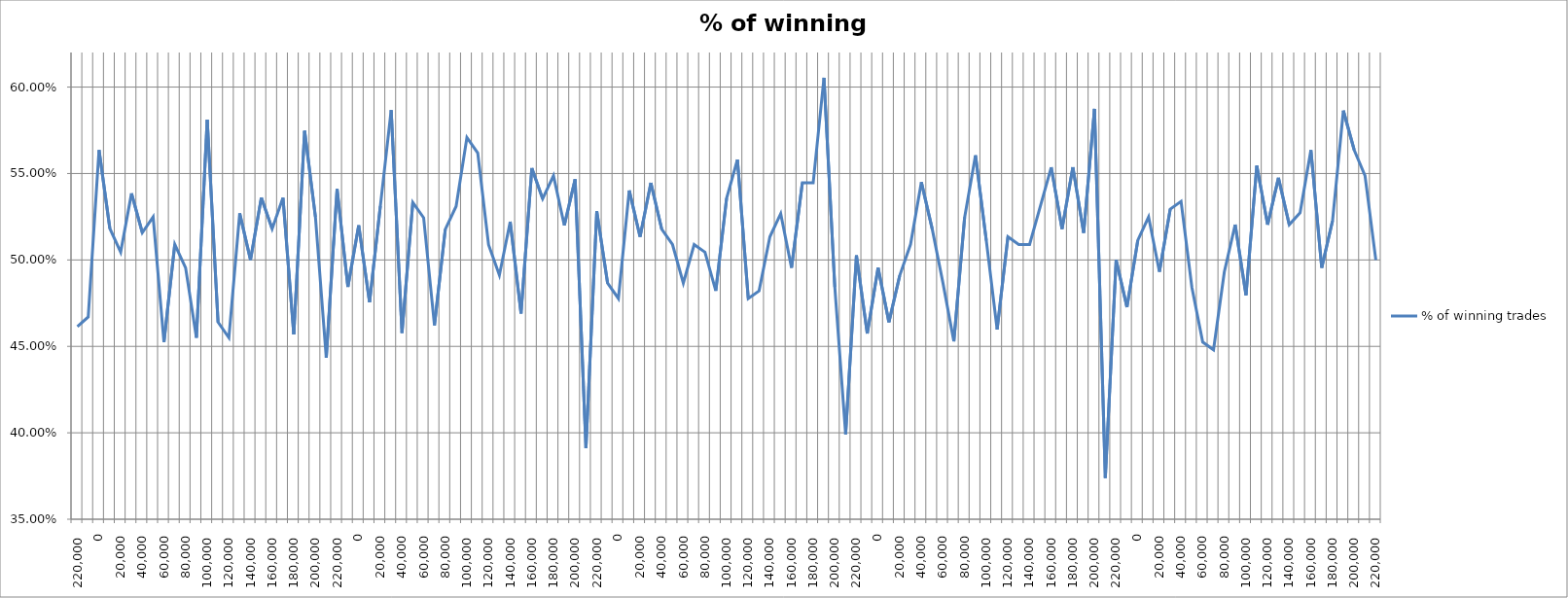
| Category | % of winning trades |
|---|---|
| 220000.0 | 0.462 |
| 230000.0 | 0.467 |
| 0.0 | 0.564 |
| 10000.0 | 0.518 |
| 20000.0 | 0.504 |
| 30000.0 | 0.538 |
| 40000.0 | 0.516 |
| 50000.0 | 0.525 |
| 60000.0 | 0.452 |
| 70000.0 | 0.509 |
| 80000.0 | 0.496 |
| 90000.0 | 0.455 |
| 100000.0 | 0.581 |
| 110000.0 | 0.464 |
| 120000.0 | 0.455 |
| 130000.0 | 0.527 |
| 140000.0 | 0.5 |
| 150000.0 | 0.536 |
| 160000.0 | 0.518 |
| 170000.0 | 0.536 |
| 180000.0 | 0.457 |
| 190000.0 | 0.575 |
| 200000.0 | 0.525 |
| 210000.0 | 0.443 |
| 220000.0 | 0.541 |
| 230000.0 | 0.484 |
| 0.0 | 0.52 |
| 10000.0 | 0.476 |
| 20000.0 | 0.531 |
| 30000.0 | 0.587 |
| 40000.0 | 0.458 |
| 50000.0 | 0.533 |
| 60000.0 | 0.524 |
| 70000.0 | 0.462 |
| 80000.0 | 0.518 |
| 90000.0 | 0.531 |
| 100000.0 | 0.571 |
| 110000.0 | 0.562 |
| 120000.0 | 0.509 |
| 130000.0 | 0.491 |
| 140000.0 | 0.522 |
| 150000.0 | 0.469 |
| 160000.0 | 0.553 |
| 170000.0 | 0.535 |
| 180000.0 | 0.549 |
| 190000.0 | 0.52 |
| 200000.0 | 0.547 |
| 210000.0 | 0.391 |
| 220000.0 | 0.528 |
| 230000.0 | 0.487 |
| 0.0 | 0.478 |
| 10000.0 | 0.54 |
| 20000.0 | 0.513 |
| 30000.0 | 0.545 |
| 40000.0 | 0.518 |
| 50000.0 | 0.509 |
| 60000.0 | 0.487 |
| 70000.0 | 0.509 |
| 80000.0 | 0.504 |
| 90000.0 | 0.482 |
| 100000.0 | 0.536 |
| 110000.0 | 0.558 |
| 120000.0 | 0.478 |
| 130000.0 | 0.482 |
| 140000.0 | 0.513 |
| 150000.0 | 0.527 |
| 160000.0 | 0.496 |
| 170000.0 | 0.545 |
| 180000.0 | 0.545 |
| 190000.0 | 0.605 |
| 200000.0 | 0.484 |
| 210000.0 | 0.399 |
| 220000.0 | 0.503 |
| 230000.0 | 0.457 |
| 0.0 | 0.496 |
| 10000.0 | 0.464 |
| 20000.0 | 0.491 |
| 30000.0 | 0.509 |
| 40000.0 | 0.545 |
| 50000.0 | 0.518 |
| 60000.0 | 0.486 |
| 70000.0 | 0.453 |
| 80000.0 | 0.525 |
| 90000.0 | 0.56 |
| 100000.0 | 0.511 |
| 110000.0 | 0.46 |
| 120000.0 | 0.513 |
| 130000.0 | 0.509 |
| 140000.0 | 0.509 |
| 150000.0 | 0.531 |
| 160000.0 | 0.554 |
| 170000.0 | 0.518 |
| 180000.0 | 0.554 |
| 190000.0 | 0.516 |
| 200000.0 | 0.587 |
| 210000.0 | 0.374 |
| 220000.0 | 0.5 |
| 230000.0 | 0.473 |
| 0.0 | 0.511 |
| 10000.0 | 0.525 |
| 20000.0 | 0.493 |
| 30000.0 | 0.529 |
| 40000.0 | 0.534 |
| 50000.0 | 0.484 |
| 60000.0 | 0.452 |
| 70000.0 | 0.448 |
| 80000.0 | 0.493 |
| 90000.0 | 0.52 |
| 100000.0 | 0.48 |
| 110000.0 | 0.554 |
| 120000.0 | 0.52 |
| 130000.0 | 0.548 |
| 140000.0 | 0.52 |
| 150000.0 | 0.527 |
| 160000.0 | 0.564 |
| 170000.0 | 0.496 |
| 180000.0 | 0.523 |
| 190000.0 | 0.586 |
| 200000.0 | 0.564 |
| 210000.0 | 0.549 |
| 220000.0 | 0.5 |